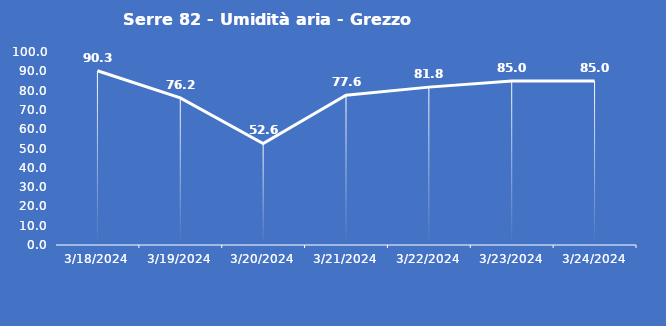
| Category | Serre 82 - Umidità aria - Grezzo (%) |
|---|---|
| 3/18/24 | 90.3 |
| 3/19/24 | 76.2 |
| 3/20/24 | 52.6 |
| 3/21/24 | 77.6 |
| 3/22/24 | 81.8 |
| 3/23/24 | 85 |
| 3/24/24 | 85 |